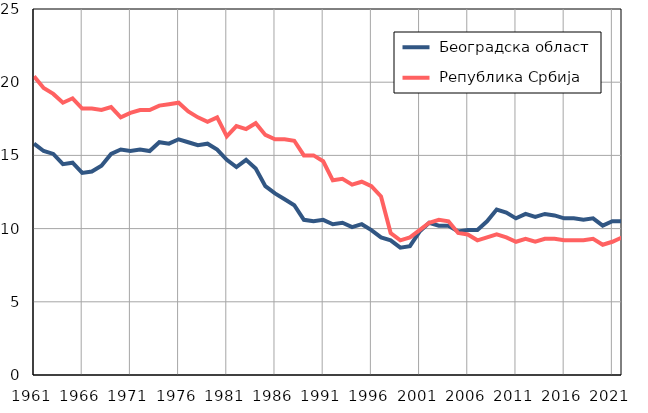
| Category |  Београдска област |  Република Србија |
|---|---|---|
| 1961.0 | 15.8 | 20.4 |
| 1962.0 | 15.3 | 19.6 |
| 1963.0 | 15.1 | 19.2 |
| 1964.0 | 14.4 | 18.6 |
| 1965.0 | 14.5 | 18.9 |
| 1966.0 | 13.8 | 18.2 |
| 1967.0 | 13.9 | 18.2 |
| 1968.0 | 14.3 | 18.1 |
| 1969.0 | 15.1 | 18.3 |
| 1970.0 | 15.4 | 17.6 |
| 1971.0 | 15.3 | 17.9 |
| 1972.0 | 15.4 | 18.1 |
| 1973.0 | 15.3 | 18.1 |
| 1974.0 | 15.9 | 18.4 |
| 1975.0 | 15.8 | 18.5 |
| 1976.0 | 16.1 | 18.6 |
| 1977.0 | 15.9 | 18 |
| 1978.0 | 15.7 | 17.6 |
| 1979.0 | 15.8 | 17.3 |
| 1980.0 | 15.4 | 17.6 |
| 1981.0 | 14.7 | 16.3 |
| 1982.0 | 14.2 | 17 |
| 1983.0 | 14.7 | 16.8 |
| 1984.0 | 14.1 | 17.2 |
| 1985.0 | 12.9 | 16.4 |
| 1986.0 | 12.4 | 16.1 |
| 1987.0 | 12 | 16.1 |
| 1988.0 | 11.6 | 16 |
| 1989.0 | 10.6 | 15 |
| 1990.0 | 10.5 | 15 |
| 1991.0 | 10.6 | 14.6 |
| 1992.0 | 10.3 | 13.3 |
| 1993.0 | 10.4 | 13.4 |
| 1994.0 | 10.1 | 13 |
| 1995.0 | 10.3 | 13.2 |
| 1996.0 | 9.9 | 12.9 |
| 1997.0 | 9.4 | 12.2 |
| 1998.0 | 9.2 | 9.7 |
| 1999.0 | 8.7 | 9.2 |
| 2000.0 | 8.8 | 9.4 |
| 2001.0 | 9.8 | 9.9 |
| 2002.0 | 10.4 | 10.4 |
| 2003.0 | 10.2 | 10.6 |
| 2004.0 | 10.2 | 10.5 |
| 2005.0 | 9.8 | 9.7 |
| 2006.0 | 9.9 | 9.6 |
| 2007.0 | 9.9 | 9.2 |
| 2008.0 | 10.5 | 9.4 |
| 2009.0 | 11.3 | 9.6 |
| 2010.0 | 11.1 | 9.4 |
| 2011.0 | 10.7 | 9.1 |
| 2012.0 | 11 | 9.3 |
| 2013.0 | 10.8 | 9.1 |
| 2014.0 | 11 | 9.3 |
| 2015.0 | 10.9 | 9.3 |
| 2016.0 | 10.7 | 9.2 |
| 2017.0 | 10.7 | 9.2 |
| 2018.0 | 10.6 | 9.2 |
| 2019.0 | 10.7 | 9.3 |
| 2020.0 | 10.2 | 8.9 |
| 2021.0 | 10.5 | 9.1 |
| 2022.0 | 10.5 | 9.4 |